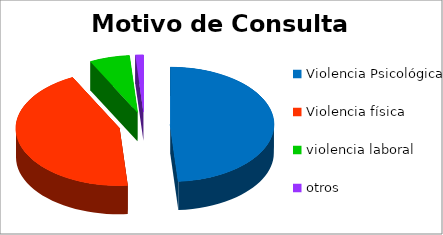
| Category | Series 0 |
|---|---|
| Violencia Psicológica | 39 |
| Violencia física | 35 |
| violencia laboral | 5 |
| otros | 1 |